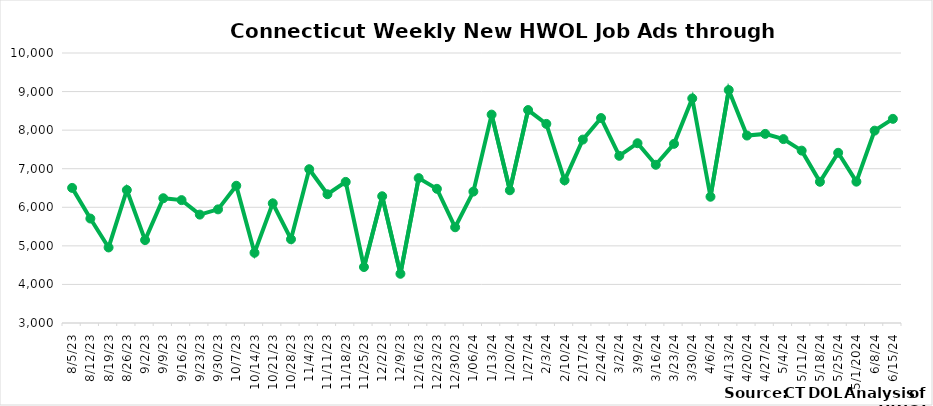
| Category | Connecticut |
|---|---|
| 8/5/23 | 6503 |
| 8/12/23 | 5708 |
| 8/19/23 | 4958 |
| 8/26/23 | 6447 |
| 9/2/23 | 5149 |
| 9/9/23 | 6235 |
| 9/16/23 | 6186 |
| 9/23/23 | 5810 |
| 9/30/23 | 5946 |
| 10/7/23 | 6558 |
| 10/14/23 | 4820 |
| 10/21/23 | 6103 |
| 10/28/23 | 5171 |
| 11/4/23 | 6987 |
| 11/11/23 | 6338 |
| 11/18/23 | 6658 |
| 11/25/23 | 4451 |
| 12/2/23 | 6286 |
| 12/9/23 | 4276 |
| 12/16/23 | 6757 |
|  12/23/23 | 6479 |
|  12/30/23 | 5482 |
|  1/06/24 | 6407 |
|  1/13/24 | 8403 |
|  1/20/24 | 6441 |
|  1/27/24 | 8521 |
|  2/3/24 | 8162 |
|  2/10/24 | 6698 |
|  2/17/24 | 7755 |
|  2/24/24 | 8314 |
|  3/2/24 | 7334 |
|  3/9/24 | 7661 |
|  3/16/24 | 7102 |
|  3/23/24 | 7645 |
|  3/30/24 | 8822 |
|  4/6/24 | 6273 |
|  4/13/24 | 9039 |
|  4/20/24 | 7860 |
|  4/27/24 | 7903 |
|  5/4/24 | 7768 |
|  5/11/24 | 7469 |
|  5/18/24 | 6661 |
|  5/25/24 | 7413 |
| 5/1/2024 | 6664 |
|  6/8/24 | 7987 |
|  6/15/24 | 8293 |